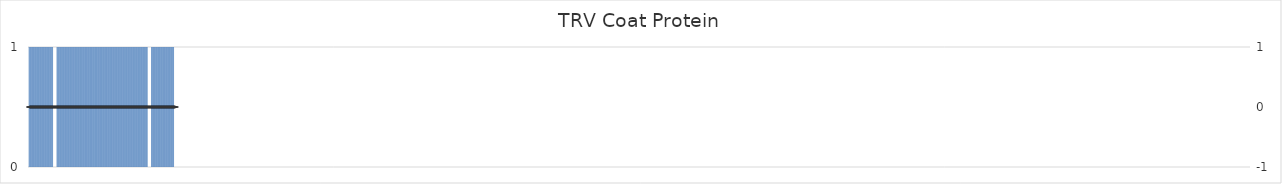
| Category | Coat Protein |
|---|---|
| 1.0 | 0 |
| 2.0 | 1 |
| 3.0 | 1 |
| 4.0 | 1 |
| 5.0 | 1 |
| 6.0 | 1 |
| 7.0 | 1 |
| 8.0 | 1 |
| 9.0 | 1 |
| 10.0 | 1 |
| 11.0 | 1 |
| 12.0 | 1 |
| 13.0 | 1 |
| 14.0 | 1 |
| 15.0 | 1 |
| 16.0 | 1 |
| 17.0 | 1 |
| 18.0 | 1 |
| 19.0 | 1 |
| 20.0 | 1 |
| 21.0 | 1 |
| 22.0 | 1 |
| 23.0 | 1 |
| 24.0 | 1 |
| 25.0 | 1 |
| 26.0 | 1 |
| 27.0 | 1 |
| 28.0 | 1 |
| 29.0 | 1 |
| 30.0 | 1 |
| 31.0 | 1 |
| 32.0 | 1 |
| 33.0 | 1 |
| 34.0 | 1 |
| 35.0 | 1 |
| 36.0 | 0 |
| 37.0 | 0 |
| 38.0 | 0 |
| 39.0 | 0 |
| 40.0 | 0 |
| 41.0 | 1 |
| 42.0 | 1 |
| 43.0 | 1 |
| 44.0 | 1 |
| 45.0 | 1 |
| 46.0 | 1 |
| 47.0 | 1 |
| 48.0 | 1 |
| 49.0 | 1 |
| 50.0 | 1 |
| 51.0 | 1 |
| 52.0 | 1 |
| 53.0 | 1 |
| 54.0 | 1 |
| 55.0 | 1 |
| 56.0 | 1 |
| 57.0 | 1 |
| 58.0 | 1 |
| 59.0 | 1 |
| 60.0 | 1 |
| 61.0 | 1 |
| 62.0 | 1 |
| 63.0 | 1 |
| 64.0 | 1 |
| 65.0 | 1 |
| 66.0 | 1 |
| 67.0 | 1 |
| 68.0 | 1 |
| 69.0 | 1 |
| 70.0 | 1 |
| 71.0 | 1 |
| 72.0 | 1 |
| 73.0 | 1 |
| 74.0 | 1 |
| 75.0 | 1 |
| 76.0 | 1 |
| 77.0 | 1 |
| 78.0 | 1 |
| 79.0 | 1 |
| 80.0 | 1 |
| 81.0 | 1 |
| 82.0 | 1 |
| 83.0 | 1 |
| 84.0 | 1 |
| 85.0 | 1 |
| 86.0 | 1 |
| 87.0 | 1 |
| 88.0 | 1 |
| 89.0 | 1 |
| 90.0 | 1 |
| 91.0 | 1 |
| 92.0 | 1 |
| 93.0 | 1 |
| 94.0 | 1 |
| 95.0 | 1 |
| 96.0 | 1 |
| 97.0 | 1 |
| 98.0 | 1 |
| 99.0 | 1 |
| 100.0 | 1 |
| 101.0 | 1 |
| 102.0 | 1 |
| 103.0 | 1 |
| 104.0 | 1 |
| 105.0 | 1 |
| 106.0 | 1 |
| 107.0 | 1 |
| 108.0 | 1 |
| 109.0 | 1 |
| 110.0 | 1 |
| 111.0 | 1 |
| 112.0 | 1 |
| 113.0 | 1 |
| 114.0 | 1 |
| 115.0 | 1 |
| 116.0 | 1 |
| 117.0 | 1 |
| 118.0 | 1 |
| 119.0 | 1 |
| 120.0 | 1 |
| 121.0 | 1 |
| 122.0 | 1 |
| 123.0 | 1 |
| 124.0 | 1 |
| 125.0 | 1 |
| 126.0 | 1 |
| 127.0 | 1 |
| 128.0 | 1 |
| 129.0 | 1 |
| 130.0 | 1 |
| 131.0 | 1 |
| 132.0 | 1 |
| 133.0 | 1 |
| 134.0 | 1 |
| 135.0 | 1 |
| 136.0 | 1 |
| 137.0 | 1 |
| 138.0 | 1 |
| 139.0 | 1 |
| 140.0 | 1 |
| 141.0 | 1 |
| 142.0 | 1 |
| 143.0 | 1 |
| 144.0 | 1 |
| 145.0 | 1 |
| 146.0 | 1 |
| 147.0 | 1 |
| 148.0 | 1 |
| 149.0 | 1 |
| 150.0 | 1 |
| 151.0 | 1 |
| 152.0 | 1 |
| 153.0 | 1 |
| 154.0 | 1 |
| 155.0 | 1 |
| 156.0 | 1 |
| 157.0 | 1 |
| 158.0 | 1 |
| 159.0 | 1 |
| 160.0 | 1 |
| 161.0 | 1 |
| 162.0 | 1 |
| 163.0 | 1 |
| 164.0 | 1 |
| 165.0 | 1 |
| 166.0 | 1 |
| 167.0 | 1 |
| 168.0 | 0 |
| 169.0 | 0 |
| 170.0 | 0 |
| 171.0 | 0 |
| 172.0 | 0 |
| 173.0 | 1 |
| 174.0 | 1 |
| 175.0 | 1 |
| 176.0 | 1 |
| 177.0 | 1 |
| 178.0 | 1 |
| 179.0 | 1 |
| 180.0 | 1 |
| 181.0 | 1 |
| 182.0 | 1 |
| 183.0 | 1 |
| 184.0 | 1 |
| 185.0 | 1 |
| 186.0 | 1 |
| 187.0 | 1 |
| 188.0 | 1 |
| 189.0 | 1 |
| 190.0 | 1 |
| 191.0 | 1 |
| 192.0 | 1 |
| 193.0 | 1 |
| 194.0 | 1 |
| 195.0 | 1 |
| 196.0 | 1 |
| 197.0 | 1 |
| 198.0 | 1 |
| 199.0 | 1 |
| 200.0 | 1 |
| 201.0 | 1 |
| 202.0 | 1 |
| 203.0 | 1 |
| 204.0 | 1 |
| 205.0 | 0 |
| 206.0 | 0 |
| 207.0 | 0 |
| 208.0 | 0 |
| 209.0 | 0 |
| 210.0 | 0 |
| 211.0 | 0 |
| 212.0 | 0 |
| 213.0 | 0 |
| 214.0 | 0 |
| 215.0 | 0 |
| 216.0 | 0 |
| 217.0 | 0 |
| 218.0 | 0 |
| 219.0 | 0 |
| 220.0 | 0 |
| 221.0 | 0 |
| 222.0 | 0 |
| 223.0 | 0 |
| 224.0 | 0 |
| 225.0 | 0 |
| 226.0 | 0 |
| 227.0 | 0 |
| 228.0 | 0 |
| 229.0 | 0 |
| 230.0 | 0 |
| 231.0 | 0 |
| 232.0 | 0 |
| 233.0 | 0 |
| 234.0 | 0 |
| 235.0 | 0 |
| 236.0 | 0 |
| 237.0 | 0 |
| 238.0 | 0 |
| 239.0 | 0 |
| 240.0 | 0 |
| 241.0 | 0 |
| 242.0 | 0 |
| 243.0 | 0 |
| 244.0 | 0 |
| 245.0 | 0 |
| 246.0 | 0 |
| 247.0 | 0 |
| 248.0 | 0 |
| 249.0 | 0 |
| 250.0 | 0 |
| 251.0 | 0 |
| 252.0 | 0 |
| 253.0 | 0 |
| 254.0 | 0 |
| 255.0 | 0 |
| 256.0 | 0 |
| 257.0 | 0 |
| 258.0 | 0 |
| 259.0 | 0 |
| 260.0 | 0 |
| 261.0 | 0 |
| 262.0 | 0 |
| 263.0 | 0 |
| 264.0 | 0 |
| 265.0 | 0 |
| 266.0 | 0 |
| 267.0 | 0 |
| 268.0 | 0 |
| 269.0 | 0 |
| 270.0 | 0 |
| 271.0 | 0 |
| 272.0 | 0 |
| 273.0 | 0 |
| 274.0 | 0 |
| 275.0 | 0 |
| 276.0 | 0 |
| 277.0 | 0 |
| 278.0 | 0 |
| 279.0 | 0 |
| 280.0 | 0 |
| 281.0 | 0 |
| 282.0 | 0 |
| 283.0 | 0 |
| 284.0 | 0 |
| 285.0 | 0 |
| 286.0 | 0 |
| 287.0 | 0 |
| 288.0 | 0 |
| 289.0 | 0 |
| 290.0 | 0 |
| 291.0 | 0 |
| 292.0 | 0 |
| 293.0 | 0 |
| 294.0 | 0 |
| 295.0 | 0 |
| 296.0 | 0 |
| 297.0 | 0 |
| 298.0 | 0 |
| 299.0 | 0 |
| 300.0 | 0 |
| 301.0 | 0 |
| 302.0 | 0 |
| 303.0 | 0 |
| 304.0 | 0 |
| 305.0 | 0 |
| 306.0 | 0 |
| 307.0 | 0 |
| 308.0 | 0 |
| 309.0 | 0 |
| 310.0 | 0 |
| 311.0 | 0 |
| 312.0 | 0 |
| 313.0 | 0 |
| 314.0 | 0 |
| 315.0 | 0 |
| 316.0 | 0 |
| 317.0 | 0 |
| 318.0 | 0 |
| 319.0 | 0 |
| 320.0 | 0 |
| 321.0 | 0 |
| 322.0 | 0 |
| 323.0 | 0 |
| 324.0 | 0 |
| 325.0 | 0 |
| 326.0 | 0 |
| 327.0 | 0 |
| 328.0 | 0 |
| 329.0 | 0 |
| 330.0 | 0 |
| 331.0 | 0 |
| 332.0 | 0 |
| 333.0 | 0 |
| 334.0 | 0 |
| 335.0 | 0 |
| 336.0 | 0 |
| 337.0 | 0 |
| 338.0 | 0 |
| 339.0 | 0 |
| 340.0 | 0 |
| 341.0 | 0 |
| 342.0 | 0 |
| 343.0 | 0 |
| 344.0 | 0 |
| 345.0 | 0 |
| 346.0 | 0 |
| 347.0 | 0 |
| 348.0 | 0 |
| 349.0 | 0 |
| 350.0 | 0 |
| 351.0 | 0 |
| 352.0 | 0 |
| 353.0 | 0 |
| 354.0 | 0 |
| 355.0 | 0 |
| 356.0 | 0 |
| 357.0 | 0 |
| 358.0 | 0 |
| 359.0 | 0 |
| 360.0 | 0 |
| 361.0 | 0 |
| 362.0 | 0 |
| 363.0 | 0 |
| 364.0 | 0 |
| 365.0 | 0 |
| 366.0 | 0 |
| 367.0 | 0 |
| 368.0 | 0 |
| 369.0 | 0 |
| 370.0 | 0 |
| 371.0 | 0 |
| 372.0 | 0 |
| 373.0 | 0 |
| 374.0 | 0 |
| 375.0 | 0 |
| 376.0 | 0 |
| 377.0 | 0 |
| 378.0 | 0 |
| 379.0 | 0 |
| 380.0 | 0 |
| 381.0 | 0 |
| 382.0 | 0 |
| 383.0 | 0 |
| 384.0 | 0 |
| 385.0 | 0 |
| 386.0 | 0 |
| 387.0 | 0 |
| 388.0 | 0 |
| 389.0 | 0 |
| 390.0 | 0 |
| 391.0 | 0 |
| 392.0 | 0 |
| 393.0 | 0 |
| 394.0 | 0 |
| 395.0 | 0 |
| 396.0 | 0 |
| 397.0 | 0 |
| 398.0 | 0 |
| 399.0 | 0 |
| 400.0 | 0 |
| 401.0 | 0 |
| 402.0 | 0 |
| 403.0 | 0 |
| 404.0 | 0 |
| 405.0 | 0 |
| 406.0 | 0 |
| 407.0 | 0 |
| 408.0 | 0 |
| 409.0 | 0 |
| 410.0 | 0 |
| 411.0 | 0 |
| 412.0 | 0 |
| 413.0 | 0 |
| 414.0 | 0 |
| 415.0 | 0 |
| 416.0 | 0 |
| 417.0 | 0 |
| 418.0 | 0 |
| 419.0 | 0 |
| 420.0 | 0 |
| 421.0 | 0 |
| 422.0 | 0 |
| 423.0 | 0 |
| 424.0 | 0 |
| 425.0 | 0 |
| 426.0 | 0 |
| 427.0 | 0 |
| 428.0 | 0 |
| 429.0 | 0 |
| 430.0 | 0 |
| 431.0 | 0 |
| 432.0 | 0 |
| 433.0 | 0 |
| 434.0 | 0 |
| 435.0 | 0 |
| 436.0 | 0 |
| 437.0 | 0 |
| 438.0 | 0 |
| 439.0 | 0 |
| 440.0 | 0 |
| 441.0 | 0 |
| 442.0 | 0 |
| 443.0 | 0 |
| 444.0 | 0 |
| 445.0 | 0 |
| 446.0 | 0 |
| 447.0 | 0 |
| 448.0 | 0 |
| 449.0 | 0 |
| 450.0 | 0 |
| 451.0 | 0 |
| 452.0 | 0 |
| 453.0 | 0 |
| 454.0 | 0 |
| 455.0 | 0 |
| 456.0 | 0 |
| 457.0 | 0 |
| 458.0 | 0 |
| 459.0 | 0 |
| 460.0 | 0 |
| 461.0 | 0 |
| 462.0 | 0 |
| 463.0 | 0 |
| 464.0 | 0 |
| 465.0 | 0 |
| 466.0 | 0 |
| 467.0 | 0 |
| 468.0 | 0 |
| 469.0 | 0 |
| 470.0 | 0 |
| 471.0 | 0 |
| 472.0 | 0 |
| 473.0 | 0 |
| 474.0 | 0 |
| 475.0 | 0 |
| 476.0 | 0 |
| 477.0 | 0 |
| 478.0 | 0 |
| 479.0 | 0 |
| 480.0 | 0 |
| 481.0 | 0 |
| 482.0 | 0 |
| 483.0 | 0 |
| 484.0 | 0 |
| 485.0 | 0 |
| 486.0 | 0 |
| 487.0 | 0 |
| 488.0 | 0 |
| 489.0 | 0 |
| 490.0 | 0 |
| 491.0 | 0 |
| 492.0 | 0 |
| 493.0 | 0 |
| 494.0 | 0 |
| 495.0 | 0 |
| 496.0 | 0 |
| 497.0 | 0 |
| 498.0 | 0 |
| 499.0 | 0 |
| 500.0 | 0 |
| 501.0 | 0 |
| 502.0 | 0 |
| 503.0 | 0 |
| 504.0 | 0 |
| 505.0 | 0 |
| 506.0 | 0 |
| 507.0 | 0 |
| 508.0 | 0 |
| 509.0 | 0 |
| 510.0 | 0 |
| 511.0 | 0 |
| 512.0 | 0 |
| 513.0 | 0 |
| 514.0 | 0 |
| 515.0 | 0 |
| 516.0 | 0 |
| 517.0 | 0 |
| 518.0 | 0 |
| 519.0 | 0 |
| 520.0 | 0 |
| 521.0 | 0 |
| 522.0 | 0 |
| 523.0 | 0 |
| 524.0 | 0 |
| 525.0 | 0 |
| 526.0 | 0 |
| 527.0 | 0 |
| 528.0 | 0 |
| 529.0 | 0 |
| 530.0 | 0 |
| 531.0 | 0 |
| 532.0 | 0 |
| 533.0 | 0 |
| 534.0 | 0 |
| 535.0 | 0 |
| 536.0 | 0 |
| 537.0 | 0 |
| 538.0 | 0 |
| 539.0 | 0 |
| 540.0 | 0 |
| 541.0 | 0 |
| 542.0 | 0 |
| 543.0 | 0 |
| 544.0 | 0 |
| 545.0 | 0 |
| 546.0 | 0 |
| 547.0 | 0 |
| 548.0 | 0 |
| 549.0 | 0 |
| 550.0 | 0 |
| 551.0 | 0 |
| 552.0 | 0 |
| 553.0 | 0 |
| 554.0 | 0 |
| 555.0 | 0 |
| 556.0 | 0 |
| 557.0 | 0 |
| 558.0 | 0 |
| 559.0 | 0 |
| 560.0 | 0 |
| 561.0 | 0 |
| 562.0 | 0 |
| 563.0 | 0 |
| 564.0 | 0 |
| 565.0 | 0 |
| 566.0 | 0 |
| 567.0 | 0 |
| 568.0 | 0 |
| 569.0 | 0 |
| 570.0 | 0 |
| 571.0 | 0 |
| 572.0 | 0 |
| 573.0 | 0 |
| 574.0 | 0 |
| 575.0 | 0 |
| 576.0 | 0 |
| 577.0 | 0 |
| 578.0 | 0 |
| 579.0 | 0 |
| 580.0 | 0 |
| 581.0 | 0 |
| 582.0 | 0 |
| 583.0 | 0 |
| 584.0 | 0 |
| 585.0 | 0 |
| 586.0 | 0 |
| 587.0 | 0 |
| 588.0 | 0 |
| 589.0 | 0 |
| 590.0 | 0 |
| 591.0 | 0 |
| 592.0 | 0 |
| 593.0 | 0 |
| 594.0 | 0 |
| 595.0 | 0 |
| 596.0 | 0 |
| 597.0 | 0 |
| 598.0 | 0 |
| 599.0 | 0 |
| 600.0 | 0 |
| 601.0 | 0 |
| 602.0 | 0 |
| 603.0 | 0 |
| 604.0 | 0 |
| 605.0 | 0 |
| 606.0 | 0 |
| 607.0 | 0 |
| 608.0 | 0 |
| 609.0 | 0 |
| 610.0 | 0 |
| 611.0 | 0 |
| 612.0 | 0 |
| 613.0 | 0 |
| 614.0 | 0 |
| 615.0 | 0 |
| 616.0 | 0 |
| 617.0 | 0 |
| 618.0 | 0 |
| 619.0 | 0 |
| 620.0 | 0 |
| 621.0 | 0 |
| 622.0 | 0 |
| 623.0 | 0 |
| 624.0 | 0 |
| 625.0 | 0 |
| 626.0 | 0 |
| 627.0 | 0 |
| 628.0 | 0 |
| 629.0 | 0 |
| 630.0 | 0 |
| 631.0 | 0 |
| 632.0 | 0 |
| 633.0 | 0 |
| 634.0 | 0 |
| 635.0 | 0 |
| 636.0 | 0 |
| 637.0 | 0 |
| 638.0 | 0 |
| 639.0 | 0 |
| 640.0 | 0 |
| 641.0 | 0 |
| 642.0 | 0 |
| 643.0 | 0 |
| 644.0 | 0 |
| 645.0 | 0 |
| 646.0 | 0 |
| 647.0 | 0 |
| 648.0 | 0 |
| 649.0 | 0 |
| 650.0 | 0 |
| 651.0 | 0 |
| 652.0 | 0 |
| 653.0 | 0 |
| 654.0 | 0 |
| 655.0 | 0 |
| 656.0 | 0 |
| 657.0 | 0 |
| 658.0 | 0 |
| 659.0 | 0 |
| 660.0 | 0 |
| 661.0 | 0 |
| 662.0 | 0 |
| 663.0 | 0 |
| 664.0 | 0 |
| 665.0 | 0 |
| 666.0 | 0 |
| 667.0 | 0 |
| 668.0 | 0 |
| 669.0 | 0 |
| 670.0 | 0 |
| 671.0 | 0 |
| 672.0 | 0 |
| 673.0 | 0 |
| 674.0 | 0 |
| 675.0 | 0 |
| 676.0 | 0 |
| 677.0 | 0 |
| 678.0 | 0 |
| 679.0 | 0 |
| 680.0 | 0 |
| 681.0 | 0 |
| 682.0 | 0 |
| 683.0 | 0 |
| 684.0 | 0 |
| 685.0 | 0 |
| 686.0 | 0 |
| 687.0 | 0 |
| 688.0 | 0 |
| 689.0 | 0 |
| 690.0 | 0 |
| 691.0 | 0 |
| 692.0 | 0 |
| 693.0 | 0 |
| 694.0 | 0 |
| 695.0 | 0 |
| 696.0 | 0 |
| 697.0 | 0 |
| 698.0 | 0 |
| 699.0 | 0 |
| 700.0 | 0 |
| 701.0 | 0 |
| 702.0 | 0 |
| 703.0 | 0 |
| 704.0 | 0 |
| 705.0 | 0 |
| 706.0 | 0 |
| 707.0 | 0 |
| 708.0 | 0 |
| 709.0 | 0 |
| 710.0 | 0 |
| 711.0 | 0 |
| 712.0 | 0 |
| 713.0 | 0 |
| 714.0 | 0 |
| 715.0 | 0 |
| 716.0 | 0 |
| 717.0 | 0 |
| 718.0 | 0 |
| 719.0 | 0 |
| 720.0 | 0 |
| 721.0 | 0 |
| 722.0 | 0 |
| 723.0 | 0 |
| 724.0 | 0 |
| 725.0 | 0 |
| 726.0 | 0 |
| 727.0 | 0 |
| 728.0 | 0 |
| 729.0 | 0 |
| 730.0 | 0 |
| 731.0 | 0 |
| 732.0 | 0 |
| 733.0 | 0 |
| 734.0 | 0 |
| 735.0 | 0 |
| 736.0 | 0 |
| 737.0 | 0 |
| 738.0 | 0 |
| 739.0 | 0 |
| 740.0 | 0 |
| 741.0 | 0 |
| 742.0 | 0 |
| 743.0 | 0 |
| 744.0 | 0 |
| 745.0 | 0 |
| 746.0 | 0 |
| 747.0 | 0 |
| 748.0 | 0 |
| 749.0 | 0 |
| 750.0 | 0 |
| 751.0 | 0 |
| 752.0 | 0 |
| 753.0 | 0 |
| 754.0 | 0 |
| 755.0 | 0 |
| 756.0 | 0 |
| 757.0 | 0 |
| 758.0 | 0 |
| 759.0 | 0 |
| 760.0 | 0 |
| 761.0 | 0 |
| 762.0 | 0 |
| 763.0 | 0 |
| 764.0 | 0 |
| 765.0 | 0 |
| 766.0 | 0 |
| 767.0 | 0 |
| 768.0 | 0 |
| 769.0 | 0 |
| 770.0 | 0 |
| 771.0 | 0 |
| 772.0 | 0 |
| 773.0 | 0 |
| 774.0 | 0 |
| 775.0 | 0 |
| 776.0 | 0 |
| 777.0 | 0 |
| 778.0 | 0 |
| 779.0 | 0 |
| 780.0 | 0 |
| 781.0 | 0 |
| 782.0 | 0 |
| 783.0 | 0 |
| 784.0 | 0 |
| 785.0 | 0 |
| 786.0 | 0 |
| 787.0 | 0 |
| 788.0 | 0 |
| 789.0 | 0 |
| 790.0 | 0 |
| 791.0 | 0 |
| 792.0 | 0 |
| 793.0 | 0 |
| 794.0 | 0 |
| 795.0 | 0 |
| 796.0 | 0 |
| 797.0 | 0 |
| 798.0 | 0 |
| 799.0 | 0 |
| 800.0 | 0 |
| 801.0 | 0 |
| 802.0 | 0 |
| 803.0 | 0 |
| 804.0 | 0 |
| 805.0 | 0 |
| 806.0 | 0 |
| 807.0 | 0 |
| 808.0 | 0 |
| 809.0 | 0 |
| 810.0 | 0 |
| 811.0 | 0 |
| 812.0 | 0 |
| 813.0 | 0 |
| 814.0 | 0 |
| 815.0 | 0 |
| 816.0 | 0 |
| 817.0 | 0 |
| 818.0 | 0 |
| 819.0 | 0 |
| 820.0 | 0 |
| 821.0 | 0 |
| 822.0 | 0 |
| 823.0 | 0 |
| 824.0 | 0 |
| 825.0 | 0 |
| 826.0 | 0 |
| 827.0 | 0 |
| 828.0 | 0 |
| 829.0 | 0 |
| 830.0 | 0 |
| 831.0 | 0 |
| 832.0 | 0 |
| 833.0 | 0 |
| 834.0 | 0 |
| 835.0 | 0 |
| 836.0 | 0 |
| 837.0 | 0 |
| 838.0 | 0 |
| 839.0 | 0 |
| 840.0 | 0 |
| 841.0 | 0 |
| 842.0 | 0 |
| 843.0 | 0 |
| 844.0 | 0 |
| 845.0 | 0 |
| 846.0 | 0 |
| 847.0 | 0 |
| 848.0 | 0 |
| 849.0 | 0 |
| 850.0 | 0 |
| 851.0 | 0 |
| 852.0 | 0 |
| 853.0 | 0 |
| 854.0 | 0 |
| 855.0 | 0 |
| 856.0 | 0 |
| 857.0 | 0 |
| 858.0 | 0 |
| 859.0 | 0 |
| 860.0 | 0 |
| 861.0 | 0 |
| 862.0 | 0 |
| 863.0 | 0 |
| 864.0 | 0 |
| 865.0 | 0 |
| 866.0 | 0 |
| 867.0 | 0 |
| 868.0 | 0 |
| 869.0 | 0 |
| 870.0 | 0 |
| 871.0 | 0 |
| 872.0 | 0 |
| 873.0 | 0 |
| 874.0 | 0 |
| 875.0 | 0 |
| 876.0 | 0 |
| 877.0 | 0 |
| 878.0 | 0 |
| 879.0 | 0 |
| 880.0 | 0 |
| 881.0 | 0 |
| 882.0 | 0 |
| 883.0 | 0 |
| 884.0 | 0 |
| 885.0 | 0 |
| 886.0 | 0 |
| 887.0 | 0 |
| 888.0 | 0 |
| 889.0 | 0 |
| 890.0 | 0 |
| 891.0 | 0 |
| 892.0 | 0 |
| 893.0 | 0 |
| 894.0 | 0 |
| 895.0 | 0 |
| 896.0 | 0 |
| 897.0 | 0 |
| 898.0 | 0 |
| 899.0 | 0 |
| 900.0 | 0 |
| 901.0 | 0 |
| 902.0 | 0 |
| 903.0 | 0 |
| 904.0 | 0 |
| 905.0 | 0 |
| 906.0 | 0 |
| 907.0 | 0 |
| 908.0 | 0 |
| 909.0 | 0 |
| 910.0 | 0 |
| 911.0 | 0 |
| 912.0 | 0 |
| 913.0 | 0 |
| 914.0 | 0 |
| 915.0 | 0 |
| 916.0 | 0 |
| 917.0 | 0 |
| 918.0 | 0 |
| 919.0 | 0 |
| 920.0 | 0 |
| 921.0 | 0 |
| 922.0 | 0 |
| 923.0 | 0 |
| 924.0 | 0 |
| 925.0 | 0 |
| 926.0 | 0 |
| 927.0 | 0 |
| 928.0 | 0 |
| 929.0 | 0 |
| 930.0 | 0 |
| 931.0 | 0 |
| 932.0 | 0 |
| 933.0 | 0 |
| 934.0 | 0 |
| 935.0 | 0 |
| 936.0 | 0 |
| 937.0 | 0 |
| 938.0 | 0 |
| 939.0 | 0 |
| 940.0 | 0 |
| 941.0 | 0 |
| 942.0 | 0 |
| 943.0 | 0 |
| 944.0 | 0 |
| 945.0 | 0 |
| 946.0 | 0 |
| 947.0 | 0 |
| 948.0 | 0 |
| 949.0 | 0 |
| 950.0 | 0 |
| 951.0 | 0 |
| 952.0 | 0 |
| 953.0 | 0 |
| 954.0 | 0 |
| 955.0 | 0 |
| 956.0 | 0 |
| 957.0 | 0 |
| 958.0 | 0 |
| 959.0 | 0 |
| 960.0 | 0 |
| 961.0 | 0 |
| 962.0 | 0 |
| 963.0 | 0 |
| 964.0 | 0 |
| 965.0 | 0 |
| 966.0 | 0 |
| 967.0 | 0 |
| 968.0 | 0 |
| 969.0 | 0 |
| 970.0 | 0 |
| 971.0 | 0 |
| 972.0 | 0 |
| 973.0 | 0 |
| 974.0 | 0 |
| 975.0 | 0 |
| 976.0 | 0 |
| 977.0 | 0 |
| 978.0 | 0 |
| 979.0 | 0 |
| 980.0 | 0 |
| 981.0 | 0 |
| 982.0 | 0 |
| 983.0 | 0 |
| 984.0 | 0 |
| 985.0 | 0 |
| 986.0 | 0 |
| 987.0 | 0 |
| 988.0 | 0 |
| 989.0 | 0 |
| 990.0 | 0 |
| 991.0 | 0 |
| 992.0 | 0 |
| 993.0 | 0 |
| 994.0 | 0 |
| 995.0 | 0 |
| 996.0 | 0 |
| 997.0 | 0 |
| 998.0 | 0 |
| 999.0 | 0 |
| 1000.0 | 0 |
| 1001.0 | 0 |
| 1002.0 | 0 |
| 1003.0 | 0 |
| 1004.0 | 0 |
| 1005.0 | 0 |
| 1006.0 | 0 |
| 1007.0 | 0 |
| 1008.0 | 0 |
| 1009.0 | 0 |
| 1010.0 | 0 |
| 1011.0 | 0 |
| 1012.0 | 0 |
| 1013.0 | 0 |
| 1014.0 | 0 |
| 1015.0 | 0 |
| 1016.0 | 0 |
| 1017.0 | 0 |
| 1018.0 | 0 |
| 1019.0 | 0 |
| 1020.0 | 0 |
| 1021.0 | 0 |
| 1022.0 | 0 |
| 1023.0 | 0 |
| 1024.0 | 0 |
| 1025.0 | 0 |
| 1026.0 | 0 |
| 1027.0 | 0 |
| 1028.0 | 0 |
| 1029.0 | 0 |
| 1030.0 | 0 |
| 1031.0 | 0 |
| 1032.0 | 0 |
| 1033.0 | 0 |
| 1034.0 | 0 |
| 1035.0 | 0 |
| 1036.0 | 0 |
| 1037.0 | 0 |
| 1038.0 | 0 |
| 1039.0 | 0 |
| 1040.0 | 0 |
| 1041.0 | 0 |
| 1042.0 | 0 |
| 1043.0 | 0 |
| 1044.0 | 0 |
| 1045.0 | 0 |
| 1046.0 | 0 |
| 1047.0 | 0 |
| 1048.0 | 0 |
| 1049.0 | 0 |
| 1050.0 | 0 |
| 1051.0 | 0 |
| 1052.0 | 0 |
| 1053.0 | 0 |
| 1054.0 | 0 |
| 1055.0 | 0 |
| 1056.0 | 0 |
| 1057.0 | 0 |
| 1058.0 | 0 |
| 1059.0 | 0 |
| 1060.0 | 0 |
| 1061.0 | 0 |
| 1062.0 | 0 |
| 1063.0 | 0 |
| 1064.0 | 0 |
| 1065.0 | 0 |
| 1066.0 | 0 |
| 1067.0 | 0 |
| 1068.0 | 0 |
| 1069.0 | 0 |
| 1070.0 | 0 |
| 1071.0 | 0 |
| 1072.0 | 0 |
| 1073.0 | 0 |
| 1074.0 | 0 |
| 1075.0 | 0 |
| 1076.0 | 0 |
| 1077.0 | 0 |
| 1078.0 | 0 |
| 1079.0 | 0 |
| 1080.0 | 0 |
| 1081.0 | 0 |
| 1082.0 | 0 |
| 1083.0 | 0 |
| 1084.0 | 0 |
| 1085.0 | 0 |
| 1086.0 | 0 |
| 1087.0 | 0 |
| 1088.0 | 0 |
| 1089.0 | 0 |
| 1090.0 | 0 |
| 1091.0 | 0 |
| 1092.0 | 0 |
| 1093.0 | 0 |
| 1094.0 | 0 |
| 1095.0 | 0 |
| 1096.0 | 0 |
| 1097.0 | 0 |
| 1098.0 | 0 |
| 1099.0 | 0 |
| 1100.0 | 0 |
| 1101.0 | 0 |
| 1102.0 | 0 |
| 1103.0 | 0 |
| 1104.0 | 0 |
| 1105.0 | 0 |
| 1106.0 | 0 |
| 1107.0 | 0 |
| 1108.0 | 0 |
| 1109.0 | 0 |
| 1110.0 | 0 |
| 1111.0 | 0 |
| 1112.0 | 0 |
| 1113.0 | 0 |
| 1114.0 | 0 |
| 1115.0 | 0 |
| 1116.0 | 0 |
| 1117.0 | 0 |
| 1118.0 | 0 |
| 1119.0 | 0 |
| 1120.0 | 0 |
| 1121.0 | 0 |
| 1122.0 | 0 |
| 1123.0 | 0 |
| 1124.0 | 0 |
| 1125.0 | 0 |
| 1126.0 | 0 |
| 1127.0 | 0 |
| 1128.0 | 0 |
| 1129.0 | 0 |
| 1130.0 | 0 |
| 1131.0 | 0 |
| 1132.0 | 0 |
| 1133.0 | 0 |
| 1134.0 | 0 |
| 1135.0 | 0 |
| 1136.0 | 0 |
| 1137.0 | 0 |
| 1138.0 | 0 |
| 1139.0 | 0 |
| 1140.0 | 0 |
| 1141.0 | 0 |
| 1142.0 | 0 |
| 1143.0 | 0 |
| 1144.0 | 0 |
| 1145.0 | 0 |
| 1146.0 | 0 |
| 1147.0 | 0 |
| 1148.0 | 0 |
| 1149.0 | 0 |
| 1150.0 | 0 |
| 1151.0 | 0 |
| 1152.0 | 0 |
| 1153.0 | 0 |
| 1154.0 | 0 |
| 1155.0 | 0 |
| 1156.0 | 0 |
| 1157.0 | 0 |
| 1158.0 | 0 |
| 1159.0 | 0 |
| 1160.0 | 0 |
| 1161.0 | 0 |
| 1162.0 | 0 |
| 1163.0 | 0 |
| 1164.0 | 0 |
| 1165.0 | 0 |
| 1166.0 | 0 |
| 1167.0 | 0 |
| 1168.0 | 0 |
| 1169.0 | 0 |
| 1170.0 | 0 |
| 1171.0 | 0 |
| 1172.0 | 0 |
| 1173.0 | 0 |
| 1174.0 | 0 |
| 1175.0 | 0 |
| 1176.0 | 0 |
| 1177.0 | 0 |
| 1178.0 | 0 |
| 1179.0 | 0 |
| 1180.0 | 0 |
| 1181.0 | 0 |
| 1182.0 | 0 |
| 1183.0 | 0 |
| 1184.0 | 0 |
| 1185.0 | 0 |
| 1186.0 | 0 |
| 1187.0 | 0 |
| 1188.0 | 0 |
| 1189.0 | 0 |
| 1190.0 | 0 |
| 1191.0 | 0 |
| 1192.0 | 0 |
| 1193.0 | 0 |
| 1194.0 | 0 |
| 1195.0 | 0 |
| 1196.0 | 0 |
| 1197.0 | 0 |
| 1198.0 | 0 |
| 1199.0 | 0 |
| 1200.0 | 0 |
| 1201.0 | 0 |
| 1202.0 | 0 |
| 1203.0 | 0 |
| 1204.0 | 0 |
| 1205.0 | 0 |
| 1206.0 | 0 |
| 1207.0 | 0 |
| 1208.0 | 0 |
| 1209.0 | 0 |
| 1210.0 | 0 |
| 1211.0 | 0 |
| 1212.0 | 0 |
| 1213.0 | 0 |
| 1214.0 | 0 |
| 1215.0 | 0 |
| 1216.0 | 0 |
| 1217.0 | 0 |
| 1218.0 | 0 |
| 1219.0 | 0 |
| 1220.0 | 0 |
| 1221.0 | 0 |
| 1222.0 | 0 |
| 1223.0 | 0 |
| 1224.0 | 0 |
| 1225.0 | 0 |
| 1226.0 | 0 |
| 1227.0 | 0 |
| 1228.0 | 0 |
| 1229.0 | 0 |
| 1230.0 | 0 |
| 1231.0 | 0 |
| 1232.0 | 0 |
| 1233.0 | 0 |
| 1234.0 | 0 |
| 1235.0 | 0 |
| 1236.0 | 0 |
| 1237.0 | 0 |
| 1238.0 | 0 |
| 1239.0 | 0 |
| 1240.0 | 0 |
| 1241.0 | 0 |
| 1242.0 | 0 |
| 1243.0 | 0 |
| 1244.0 | 0 |
| 1245.0 | 0 |
| 1246.0 | 0 |
| 1247.0 | 0 |
| 1248.0 | 0 |
| 1249.0 | 0 |
| 1250.0 | 0 |
| 1251.0 | 0 |
| 1252.0 | 0 |
| 1253.0 | 0 |
| 1254.0 | 0 |
| 1255.0 | 0 |
| 1256.0 | 0 |
| 1257.0 | 0 |
| 1258.0 | 0 |
| 1259.0 | 0 |
| 1260.0 | 0 |
| 1261.0 | 0 |
| 1262.0 | 0 |
| 1263.0 | 0 |
| 1264.0 | 0 |
| 1265.0 | 0 |
| 1266.0 | 0 |
| 1267.0 | 0 |
| 1268.0 | 0 |
| 1269.0 | 0 |
| 1270.0 | 0 |
| 1271.0 | 0 |
| 1272.0 | 0 |
| 1273.0 | 0 |
| 1274.0 | 0 |
| 1275.0 | 0 |
| 1276.0 | 0 |
| 1277.0 | 0 |
| 1278.0 | 0 |
| 1279.0 | 0 |
| 1280.0 | 0 |
| 1281.0 | 0 |
| 1282.0 | 0 |
| 1283.0 | 0 |
| 1284.0 | 0 |
| 1285.0 | 0 |
| 1286.0 | 0 |
| 1287.0 | 0 |
| 1288.0 | 0 |
| 1289.0 | 0 |
| 1290.0 | 0 |
| 1291.0 | 0 |
| 1292.0 | 0 |
| 1293.0 | 0 |
| 1294.0 | 0 |
| 1295.0 | 0 |
| 1296.0 | 0 |
| 1297.0 | 0 |
| 1298.0 | 0 |
| 1299.0 | 0 |
| 1300.0 | 0 |
| 1301.0 | 0 |
| 1302.0 | 0 |
| 1303.0 | 0 |
| 1304.0 | 0 |
| 1305.0 | 0 |
| 1306.0 | 0 |
| 1307.0 | 0 |
| 1308.0 | 0 |
| 1309.0 | 0 |
| 1310.0 | 0 |
| 1311.0 | 0 |
| 1312.0 | 0 |
| 1313.0 | 0 |
| 1314.0 | 0 |
| 1315.0 | 0 |
| 1316.0 | 0 |
| 1317.0 | 0 |
| 1318.0 | 0 |
| 1319.0 | 0 |
| 1320.0 | 0 |
| 1321.0 | 0 |
| 1322.0 | 0 |
| 1323.0 | 0 |
| 1324.0 | 0 |
| 1325.0 | 0 |
| 1326.0 | 0 |
| 1327.0 | 0 |
| 1328.0 | 0 |
| 1329.0 | 0 |
| 1330.0 | 0 |
| 1331.0 | 0 |
| 1332.0 | 0 |
| 1333.0 | 0 |
| 1334.0 | 0 |
| 1335.0 | 0 |
| 1336.0 | 0 |
| 1337.0 | 0 |
| 1338.0 | 0 |
| 1339.0 | 0 |
| 1340.0 | 0 |
| 1341.0 | 0 |
| 1342.0 | 0 |
| 1343.0 | 0 |
| 1344.0 | 0 |
| 1345.0 | 0 |
| 1346.0 | 0 |
| 1347.0 | 0 |
| 1348.0 | 0 |
| 1349.0 | 0 |
| 1350.0 | 0 |
| 1351.0 | 0 |
| 1352.0 | 0 |
| 1353.0 | 0 |
| 1354.0 | 0 |
| 1355.0 | 0 |
| 1356.0 | 0 |
| 1357.0 | 0 |
| 1358.0 | 0 |
| 1359.0 | 0 |
| 1360.0 | 0 |
| 1361.0 | 0 |
| 1362.0 | 0 |
| 1363.0 | 0 |
| 1364.0 | 0 |
| 1365.0 | 0 |
| 1366.0 | 0 |
| 1367.0 | 0 |
| 1368.0 | 0 |
| 1369.0 | 0 |
| 1370.0 | 0 |
| 1371.0 | 0 |
| 1372.0 | 0 |
| 1373.0 | 0 |
| 1374.0 | 0 |
| 1375.0 | 0 |
| 1376.0 | 0 |
| 1377.0 | 0 |
| 1378.0 | 0 |
| 1379.0 | 0 |
| 1380.0 | 0 |
| 1381.0 | 0 |
| 1382.0 | 0 |
| 1383.0 | 0 |
| 1384.0 | 0 |
| 1385.0 | 0 |
| 1386.0 | 0 |
| 1387.0 | 0 |
| 1388.0 | 0 |
| 1389.0 | 0 |
| 1390.0 | 0 |
| 1391.0 | 0 |
| 1392.0 | 0 |
| 1393.0 | 0 |
| 1394.0 | 0 |
| 1395.0 | 0 |
| 1396.0 | 0 |
| 1397.0 | 0 |
| 1398.0 | 0 |
| 1399.0 | 0 |
| 1400.0 | 0 |
| 1401.0 | 0 |
| 1402.0 | 0 |
| 1403.0 | 0 |
| 1404.0 | 0 |
| 1405.0 | 0 |
| 1406.0 | 0 |
| 1407.0 | 0 |
| 1408.0 | 0 |
| 1409.0 | 0 |
| 1410.0 | 0 |
| 1411.0 | 0 |
| 1412.0 | 0 |
| 1413.0 | 0 |
| 1414.0 | 0 |
| 1415.0 | 0 |
| 1416.0 | 0 |
| 1417.0 | 0 |
| 1418.0 | 0 |
| 1419.0 | 0 |
| 1420.0 | 0 |
| 1421.0 | 0 |
| 1422.0 | 0 |
| 1423.0 | 0 |
| 1424.0 | 0 |
| 1425.0 | 0 |
| 1426.0 | 0 |
| 1427.0 | 0 |
| 1428.0 | 0 |
| 1429.0 | 0 |
| 1430.0 | 0 |
| 1431.0 | 0 |
| 1432.0 | 0 |
| 1433.0 | 0 |
| 1434.0 | 0 |
| 1435.0 | 0 |
| 1436.0 | 0 |
| 1437.0 | 0 |
| 1438.0 | 0 |
| 1439.0 | 0 |
| 1440.0 | 0 |
| 1441.0 | 0 |
| 1442.0 | 0 |
| 1443.0 | 0 |
| 1444.0 | 0 |
| 1445.0 | 0 |
| 1446.0 | 0 |
| 1447.0 | 0 |
| 1448.0 | 0 |
| 1449.0 | 0 |
| 1450.0 | 0 |
| 1451.0 | 0 |
| 1452.0 | 0 |
| 1453.0 | 0 |
| 1454.0 | 0 |
| 1455.0 | 0 |
| 1456.0 | 0 |
| 1457.0 | 0 |
| 1458.0 | 0 |
| 1459.0 | 0 |
| 1460.0 | 0 |
| 1461.0 | 0 |
| 1462.0 | 0 |
| 1463.0 | 0 |
| 1464.0 | 0 |
| 1465.0 | 0 |
| 1466.0 | 0 |
| 1467.0 | 0 |
| 1468.0 | 0 |
| 1469.0 | 0 |
| 1470.0 | 0 |
| 1471.0 | 0 |
| 1472.0 | 0 |
| 1473.0 | 0 |
| 1474.0 | 0 |
| 1475.0 | 0 |
| 1476.0 | 0 |
| 1477.0 | 0 |
| 1478.0 | 0 |
| 1479.0 | 0 |
| 1480.0 | 0 |
| 1481.0 | 0 |
| 1482.0 | 0 |
| 1483.0 | 0 |
| 1484.0 | 0 |
| 1485.0 | 0 |
| 1486.0 | 0 |
| 1487.0 | 0 |
| 1488.0 | 0 |
| 1489.0 | 0 |
| 1490.0 | 0 |
| 1491.0 | 0 |
| 1492.0 | 0 |
| 1493.0 | 0 |
| 1494.0 | 0 |
| 1495.0 | 0 |
| 1496.0 | 0 |
| 1497.0 | 0 |
| 1498.0 | 0 |
| 1499.0 | 0 |
| 1500.0 | 0 |
| 1501.0 | 0 |
| 1502.0 | 0 |
| 1503.0 | 0 |
| 1504.0 | 0 |
| 1505.0 | 0 |
| 1506.0 | 0 |
| 1507.0 | 0 |
| 1508.0 | 0 |
| 1509.0 | 0 |
| 1510.0 | 0 |
| 1511.0 | 0 |
| 1512.0 | 0 |
| 1513.0 | 0 |
| 1514.0 | 0 |
| 1515.0 | 0 |
| 1516.0 | 0 |
| 1517.0 | 0 |
| 1518.0 | 0 |
| 1519.0 | 0 |
| 1520.0 | 0 |
| 1521.0 | 0 |
| 1522.0 | 0 |
| 1523.0 | 0 |
| 1524.0 | 0 |
| 1525.0 | 0 |
| 1526.0 | 0 |
| 1527.0 | 0 |
| 1528.0 | 0 |
| 1529.0 | 0 |
| 1530.0 | 0 |
| 1531.0 | 0 |
| 1532.0 | 0 |
| 1533.0 | 0 |
| 1534.0 | 0 |
| 1535.0 | 0 |
| 1536.0 | 0 |
| 1537.0 | 0 |
| 1538.0 | 0 |
| 1539.0 | 0 |
| 1540.0 | 0 |
| 1541.0 | 0 |
| 1542.0 | 0 |
| 1543.0 | 0 |
| 1544.0 | 0 |
| 1545.0 | 0 |
| 1546.0 | 0 |
| 1547.0 | 0 |
| 1548.0 | 0 |
| 1549.0 | 0 |
| 1550.0 | 0 |
| 1551.0 | 0 |
| 1552.0 | 0 |
| 1553.0 | 0 |
| 1554.0 | 0 |
| 1555.0 | 0 |
| 1556.0 | 0 |
| 1557.0 | 0 |
| 1558.0 | 0 |
| 1559.0 | 0 |
| 1560.0 | 0 |
| 1561.0 | 0 |
| 1562.0 | 0 |
| 1563.0 | 0 |
| 1564.0 | 0 |
| 1565.0 | 0 |
| 1566.0 | 0 |
| 1567.0 | 0 |
| 1568.0 | 0 |
| 1569.0 | 0 |
| 1570.0 | 0 |
| 1571.0 | 0 |
| 1572.0 | 0 |
| 1573.0 | 0 |
| 1574.0 | 0 |
| 1575.0 | 0 |
| 1576.0 | 0 |
| 1577.0 | 0 |
| 1578.0 | 0 |
| 1579.0 | 0 |
| 1580.0 | 0 |
| 1581.0 | 0 |
| 1582.0 | 0 |
| 1583.0 | 0 |
| 1584.0 | 0 |
| 1585.0 | 0 |
| 1586.0 | 0 |
| 1587.0 | 0 |
| 1588.0 | 0 |
| 1589.0 | 0 |
| 1590.0 | 0 |
| 1591.0 | 0 |
| 1592.0 | 0 |
| 1593.0 | 0 |
| 1594.0 | 0 |
| 1595.0 | 0 |
| 1596.0 | 0 |
| 1597.0 | 0 |
| 1598.0 | 0 |
| 1599.0 | 0 |
| 1600.0 | 0 |
| 1601.0 | 0 |
| 1602.0 | 0 |
| 1603.0 | 0 |
| 1604.0 | 0 |
| 1605.0 | 0 |
| 1606.0 | 0 |
| 1607.0 | 0 |
| 1608.0 | 0 |
| 1609.0 | 0 |
| 1610.0 | 0 |
| 1611.0 | 0 |
| 1612.0 | 0 |
| 1613.0 | 0 |
| 1614.0 | 0 |
| 1615.0 | 0 |
| 1616.0 | 0 |
| 1617.0 | 0 |
| 1618.0 | 0 |
| 1619.0 | 0 |
| 1620.0 | 0 |
| 1621.0 | 0 |
| 1622.0 | 0 |
| 1623.0 | 0 |
| 1624.0 | 0 |
| 1625.0 | 0 |
| 1626.0 | 0 |
| 1627.0 | 0 |
| 1628.0 | 0 |
| 1629.0 | 0 |
| 1630.0 | 0 |
| 1631.0 | 0 |
| 1632.0 | 0 |
| 1633.0 | 0 |
| 1634.0 | 0 |
| 1635.0 | 0 |
| 1636.0 | 0 |
| 1637.0 | 0 |
| 1638.0 | 0 |
| 1639.0 | 0 |
| 1640.0 | 0 |
| 1641.0 | 0 |
| 1642.0 | 0 |
| 1643.0 | 0 |
| 1644.0 | 0 |
| 1645.0 | 0 |
| 1646.0 | 0 |
| 1647.0 | 0 |
| 1648.0 | 0 |
| 1649.0 | 0 |
| 1650.0 | 0 |
| 1651.0 | 0 |
| 1652.0 | 0 |
| 1653.0 | 0 |
| 1654.0 | 0 |
| 1655.0 | 0 |
| 1656.0 | 0 |
| 1657.0 | 0 |
| 1658.0 | 0 |
| 1659.0 | 0 |
| 1660.0 | 0 |
| 1661.0 | 0 |
| 1662.0 | 0 |
| 1663.0 | 0 |
| 1664.0 | 0 |
| 1665.0 | 0 |
| 1666.0 | 0 |
| 1667.0 | 0 |
| 1668.0 | 0 |
| 1669.0 | 0 |
| 1670.0 | 0 |
| 1671.0 | 0 |
| 1672.0 | 0 |
| 1673.0 | 0 |
| 1674.0 | 0 |
| 1675.0 | 0 |
| 1676.0 | 0 |
| 1677.0 | 0 |
| 1678.0 | 0 |
| 1679.0 | 0 |
| 1680.0 | 0 |
| 1681.0 | 0 |
| 1682.0 | 0 |
| 1683.0 | 0 |
| 1684.0 | 0 |
| 1685.0 | 0 |
| 1686.0 | 0 |
| 1687.0 | 0 |
| 1688.0 | 0 |
| 1689.0 | 0 |
| 1690.0 | 0 |
| 1691.0 | 0 |
| 1692.0 | 0 |
| 1693.0 | 0 |
| 1694.0 | 0 |
| 1695.0 | 0 |
| 1696.0 | 0 |
| 1697.0 | 0 |
| 1698.0 | 0 |
| 1699.0 | 0 |
| 1700.0 | 0 |
| 1701.0 | 0 |
| 1702.0 | 0 |
| 1703.0 | 0 |
| 1704.0 | 0 |
| 1705.0 | 0 |
| 1706.0 | 0 |
| 1707.0 | 0 |